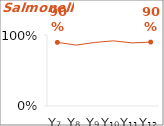
| Category | Salmonella 2b |
|---|---|
| Y₇ | 0.897 |
| Y₈ | 0.858 |
| Y₉ | 0.895 |
| Y₁₀ | 0.918 |
| Y₁₁ | 0.889 |
| Y₁₂ | 0.9 |